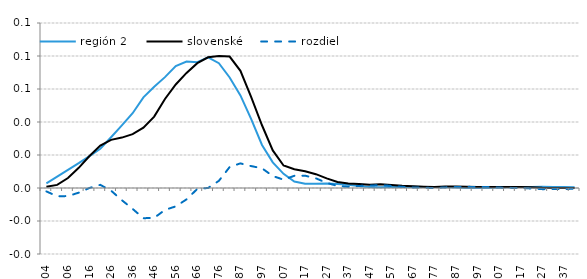
| Category | región 2 | slovenské | rozdiel |
|---|---|---|---|
| -0.03972342 | 0.003 | 0.001 | -0.002 |
| 0.01054863 | 0.007 | 0.002 | -0.005 |
| 0.06082068 | 0.011 | 0.006 | -0.005 |
| 0.11109273 | 0.015 | 0.012 | -0.003 |
| 0.16136479 | 0.019 | 0.019 | 0 |
| 0.21163684 | 0.024 | 0.026 | 0.002 |
| 0.26190889 | 0.031 | 0.029 | -0.002 |
| 0.31218094 | 0.038 | 0.031 | -0.007 |
| 0.362453 | 0.045 | 0.033 | -0.013 |
| 0.41272505 | 0.055 | 0.037 | -0.018 |
| 0.4629971 | 0.061 | 0.043 | -0.018 |
| 0.51326915 | 0.067 | 0.054 | -0.013 |
| 0.56354121 | 0.074 | 0.063 | -0.011 |
| 0.61381326 | 0.077 | 0.07 | -0.007 |
| 0.66408531 | 0.076 | 0.076 | -0.001 |
| 0.71435736 | 0.079 | 0.079 | 0 |
| 0.76462941 | 0.076 | 0.08 | 0.004 |
| 0.81490147 | 0.067 | 0.08 | 0.013 |
| 0.86517352 | 0.056 | 0.071 | 0.015 |
| 0.91544557 | 0.042 | 0.055 | 0.013 |
| 0.96571762 | 0.026 | 0.038 | 0.012 |
| 1.0159897 | 0.016 | 0.023 | 0.007 |
| 1.0662617 | 0.009 | 0.014 | 0.005 |
| 1.1165338 | 0.004 | 0.011 | 0.007 |
| 1.1668058 | 0.003 | 0.01 | 0.007 |
| 1.2170779 | 0.003 | 0.008 | 0.006 |
| 1.2673499 | 0.003 | 0.006 | 0.003 |
| 1.317622 | 0.002 | 0.004 | 0.001 |
| 1.367894 | 0.002 | 0.003 | 0.001 |
| 1.4181661 | 0.001 | 0.002 | 0.001 |
| 1.4684381 | 0.001 | 0.002 | 0.001 |
| 1.5187102 | 0 | 0.002 | 0.002 |
| 1.5689823 | 0.001 | 0.002 | 0.001 |
| 1.6192543 | 0.001 | 0.001 | 0.001 |
| 1.6695264 | 0.001 | 0.001 | 0 |
| 1.7197984 | 0.001 | 0.001 | 0 |
| 1.7700705 | 0.001 | 0.001 | 0 |
| 1.8203425 | 0.001 | 0.001 | 0 |
| 1.8706146 | 0 | 0.001 | 0.001 |
| 1.9208866 | 0 | 0.001 | 0.001 |
| 1.9711587 | 0 | 0.001 | 0.001 |
| 2.0214307 | 0 | 0.001 | 0.001 |
| 2.0717028 | 0 | 0.001 | 0 |
| 2.1219748 | 0 | 0.001 | 0 |
| 2.1722469 | 0.001 | 0.001 | 0 |
| 2.2225189 | 0.001 | 0 | 0 |
| 2.272791 | 0.001 | 0 | -0.001 |
| 2.323063 | 0.001 | 0 | -0.001 |
| 2.3733351 | 0.001 | 0 | -0.001 |
| 2.4236071 | 0 | 0 | 0 |